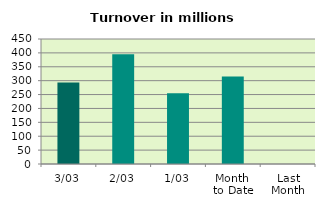
| Category | Series 0 |
|---|---|
| 3/03 | 293.827 |
| 2/03 | 395.293 |
| 1/03 | 254.815 |
| Month 
to Date | 314.645 |
| Last
Month | 0 |